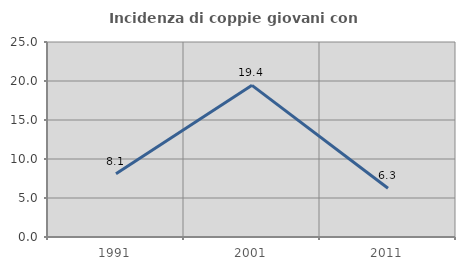
| Category | Incidenza di coppie giovani con figli |
|---|---|
| 1991.0 | 8.108 |
| 2001.0 | 19.444 |
| 2011.0 | 6.25 |